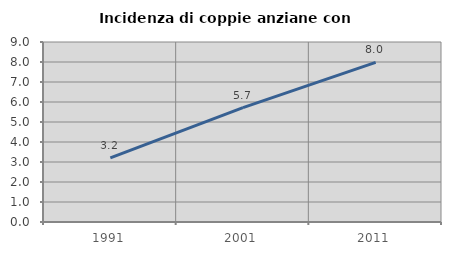
| Category | Incidenza di coppie anziane con figli |
|---|---|
| 1991.0 | 3.202 |
| 2001.0 | 5.717 |
| 2011.0 | 7.983 |